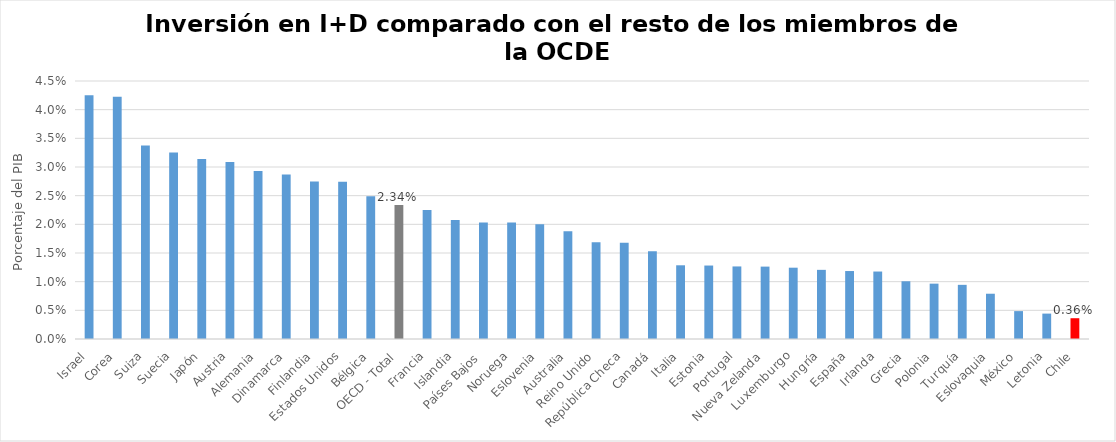
| Category | Gasto I+D - % PIB |
|---|---|
| Israel | 0.043 |
| Corea | 0.042 |
| Suiza | 0.034 |
| Suecia | 0.033 |
| Japón | 0.031 |
| Austria | 0.031 |
| Alemania | 0.029 |
| Dinamarca | 0.029 |
| Finlandia | 0.027 |
| Estados Unidos | 0.027 |
| Bélgica | 0.025 |
| OECD - Total | 0.023 |
| Francia | 0.022 |
| Islandia | 0.021 |
| Países Bajos | 0.02 |
| Noruega | 0.02 |
| Eslovenia | 0.02 |
| Australia | 0.019 |
| Reino Unido | 0.017 |
| República Checa | 0.017 |
| Canadá | 0.015 |
| Italia | 0.013 |
| Estonia | 0.013 |
| Portugal | 0.013 |
| Nueva Zelanda | 0.013 |
| Luxemburgo | 0.012 |
| Hungría | 0.012 |
| España | 0.012 |
| Irlanda | 0.012 |
| Grecia | 0.01 |
| Polonia | 0.01 |
| Turquía | 0.009 |
| Eslovaquia | 0.008 |
| México | 0.005 |
| Letonia | 0.004 |
| Chile | 0.004 |